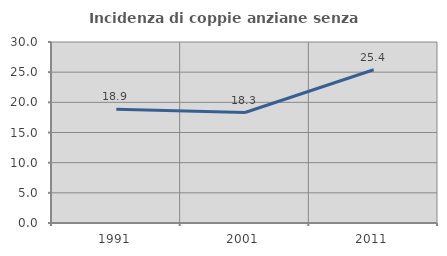
| Category | Incidenza di coppie anziane senza figli  |
|---|---|
| 1991.0 | 18.868 |
| 2001.0 | 18.31 |
| 2011.0 | 25.397 |